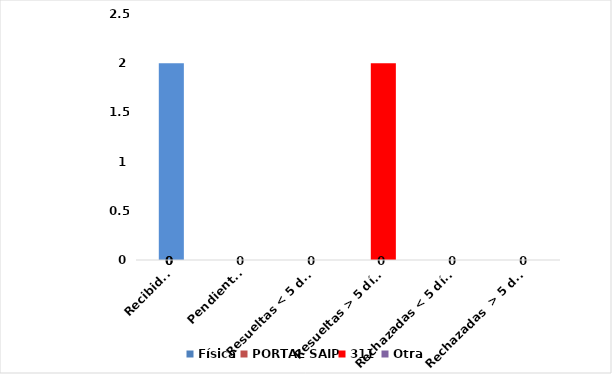
| Category | Física | PORTAL SAIP | 311 | Otra |
|---|---|---|---|---|
| Recibidas  | 0 | 0 | 2 | 0 |
| Pendientes  | 0 | 0 | 0 | 0 |
| Resueltas < 5 días | 0 | 0 | 0 | 0 |
| Resueltas > 5 días  | 0 | 0 | 2 | 0 |
| Rechazadas < 5 días  | 0 | 0 | 0 | 0 |
| Rechazadas  > 5 días | 0 | 0 | 0 | 0 |